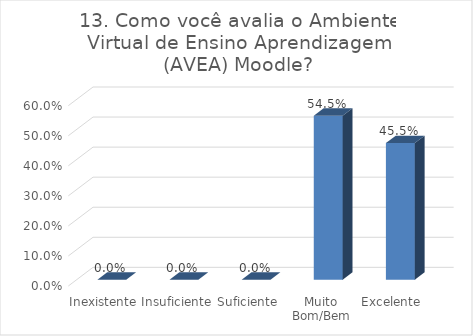
| Category | 13. Como você avalia o Ambiente Virtual de Ensino Aprendizagem (AVEA) Moodle? |
|---|---|
| Inexistente | 0 |
| Insuficiente | 0 |
| Suficiente | 0 |
| Muito Bom/Bem | 0.545 |
| Excelente | 0.455 |